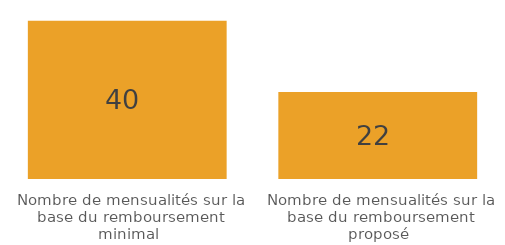
| Category | Series 0 |
|---|---|
| Nombre de mensualités sur la base du remboursement minimal | 40 |
| Nombre de mensualités sur la base du remboursement proposé | 22 |